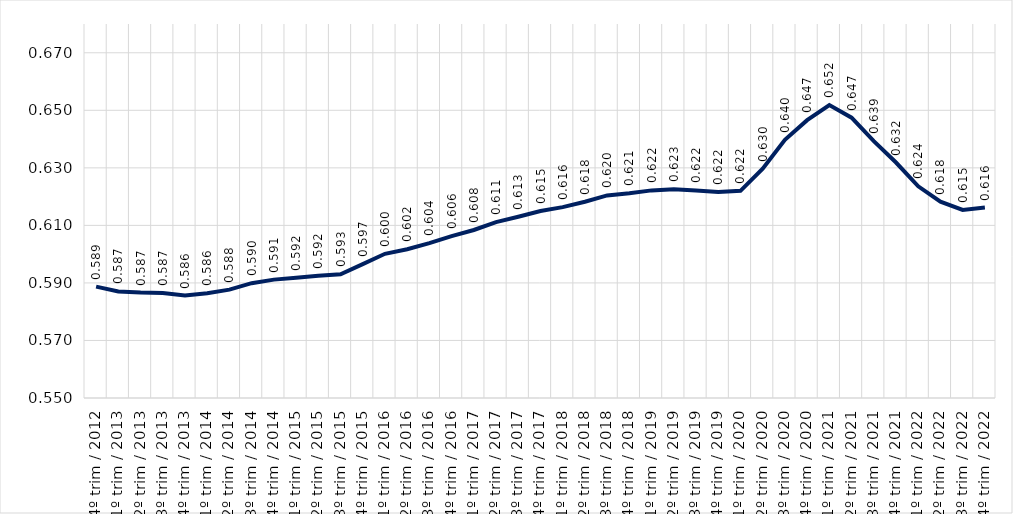
| Category | Conjunto RMs |
|---|---|
| 4º trim / 2012 | 0.589 |
| 1º trim / 2013 | 0.587 |
| 2º trim / 2013 | 0.587 |
| 3º trim / 2013 | 0.587 |
| 4º trim / 2013 | 0.586 |
| 1º trim / 2014 | 0.586 |
| 2º trim / 2014 | 0.588 |
| 3º trim / 2014 | 0.59 |
| 4º trim / 2014 | 0.591 |
| 1º trim / 2015 | 0.592 |
| 2º trim / 2015 | 0.592 |
| 3º trim / 2015 | 0.593 |
| 4º trim / 2015 | 0.597 |
| 1º trim / 2016 | 0.6 |
| 2º trim / 2016 | 0.602 |
| 3º trim / 2016 | 0.604 |
| 4º trim / 2016 | 0.606 |
| 1º trim / 2017 | 0.608 |
| 2º trim / 2017 | 0.611 |
| 3º trim / 2017 | 0.613 |
| 4º trim / 2017 | 0.615 |
| 1º trim / 2018 | 0.616 |
| 2º trim / 2018 | 0.618 |
| 3º trim / 2018 | 0.62 |
| 4º trim / 2018 | 0.621 |
| 1º trim / 2019 | 0.622 |
| 2º trim / 2019 | 0.623 |
| 3º trim / 2019 | 0.622 |
| 4º trim / 2019 | 0.622 |
| 1º trim / 2020 | 0.622 |
| 2º trim / 2020 | 0.63 |
| 3º trim / 2020 | 0.64 |
| 4º trim / 2020 | 0.647 |
| 1º trim / 2021 | 0.652 |
| 2º trim / 2021 | 0.647 |
| 3º trim / 2021 | 0.639 |
| 4º trim / 2021 | 0.632 |
| 1º trim / 2022 | 0.624 |
| 2º trim / 2022 | 0.618 |
| 3º trim / 2022 | 0.615 |
| 4º trim / 2022 | 0.616 |